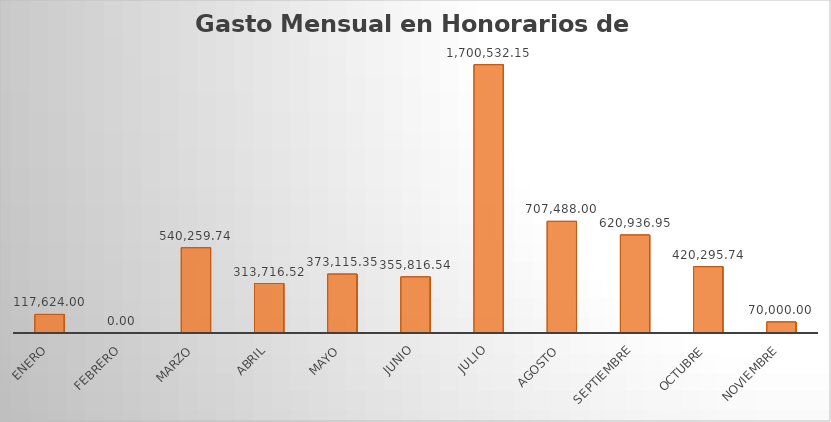
| Category | Monto |
|---|---|
| ENERO | 117624 |
| FEBRERO | 0 |
| MARZO | 540259.74 |
| ABRIL | 313716.52 |
| MAYO | 373115.35 |
| JUNIO | 355816.54 |
| JULIO | 1700532.15 |
| AGOSTO | 707488 |
| SEPTIEMBRE | 620936.95 |
| OCTUBRE | 420295.74 |
| NOVIEMBRE | 70000 |